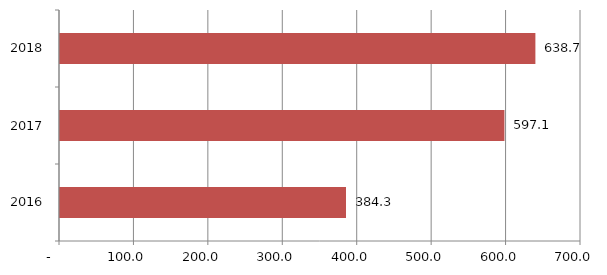
| Category | Series 0 |
|---|---|
| 2016.0 | 384.259 |
| 2017.0 | 597.139 |
| 2018.0 | 638.722 |